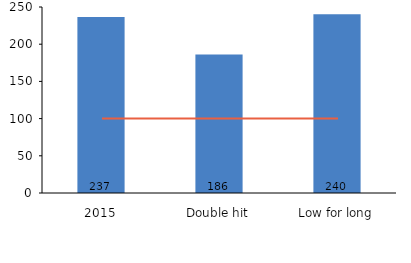
| Category | Series 0 |
|---|---|
| 2015 | 236.61 |
| Double hit | 186.24 |
| Low for long | 240.17 |